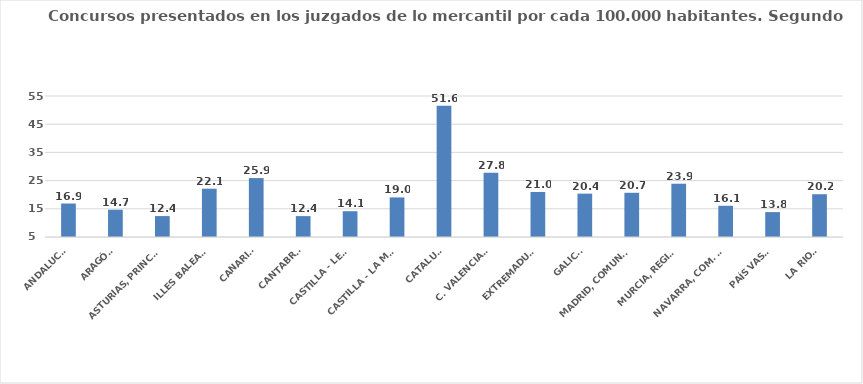
| Category | Series 0 |
|---|---|
| ANDALUCÍA | 16.867 |
| ARAGÓN | 14.674 |
| ASTURIAS, PRINCIPADO | 12.418 |
| ILLES BALEARS | 22.126 |
| CANARIAS | 25.894 |
| CANTABRIA | 12.404 |
| CASTILLA - LEÓN | 14.144 |
| CASTILLA - LA MANCHA | 19.033 |
| CATALUÑA | 51.576 |
| C. VALENCIANA | 27.787 |
| EXTREMADURA | 20.962 |
| GALICIA | 20.373 |
| MADRID, COMUNIDAD | 20.675 |
| MURCIA, REGIÓN | 23.894 |
| NAVARRA, COM. FORAL | 16.067 |
| PAÍS VASCO | 13.829 |
| LA RIOJA | 20.17 |